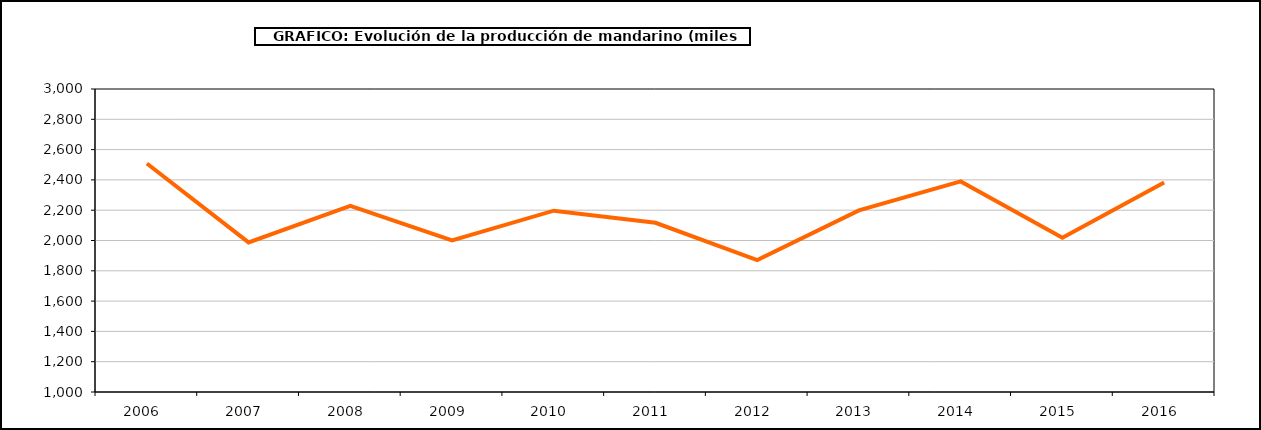
| Category | producción |
|---|---|
| 2006.0 | 2508.049 |
| 2007.0 | 1987.432 |
| 2008.0 | 2227.916 |
| 2009.0 | 2000.149 |
| 2010.0 | 2196.89 |
| 2011.0 | 2117.119 |
| 2012.0 | 1871.265 |
| 2013.0 | 2198.926 |
| 2014.0 | 2389.894 |
| 2015.0 | 2018.755 |
| 2016.0 | 2382.073 |